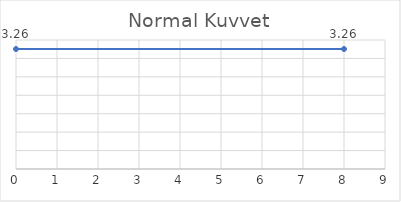
| Category | Series 0 |
|---|---|
| 0.0 | 3.256 |
| 8.0 | 3.256 |